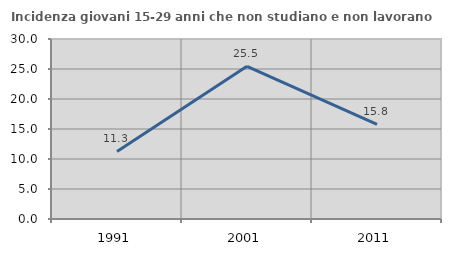
| Category | Incidenza giovani 15-29 anni che non studiano e non lavorano  |
|---|---|
| 1991.0 | 11.259 |
| 2001.0 | 25.455 |
| 2011.0 | 15.789 |